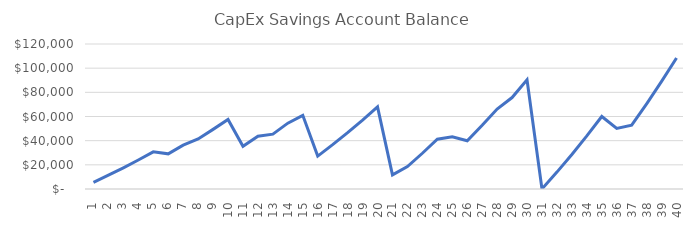
| Category | CapEx Savings Acct Balance |
|---|---|
| 1.0 | 5568 |
| 2.0 | 11414.4 |
| 3.0 | 17549.779 |
| 4.0 | 23985.079 |
| 5.0 | 30731.613 |
| 6.0 | 29106.528 |
| 7.0 | 36337.142 |
| 8.0 | 41452.075 |
| 9.0 | 49334.492 |
| 10.0 | 57586.159 |
| 11.0 | 35310.732 |
| 12.0 | 43724.361 |
| 13.0 | 45408.68 |
| 14.0 | 54493.649 |
| 15.0 | 60980.442 |
| 16.0 | 27251.726 |
| 17.0 | 36731.766 |
| 18.0 | 46669.457 |
| 19.0 | 57081.993 |
| 20.0 | 67987.155 |
| 21.0 | 11674.154 |
| 22.0 | 18545.168 |
| 23.0 | 29584.935 |
| 24.0 | 41165.564 |
| 25.0 | 43143.502 |
| 26.0 | 39961.193 |
| 27.0 | 52768.317 |
| 28.0 | 66191.821 |
| 29.0 | 75678.983 |
| 30.0 | 90313.92 |
| 31.0 | 49.278 |
| 32.0 | 13970.711 |
| 33.0 | 28588.186 |
| 34.0 | 43928.152 |
| 35.0 | 60017.964 |
| 36.0 | 50154.216 |
| 37.0 | 52803.522 |
| 38.0 | 70481.335 |
| 39.0 | 89011.356 |
| 40.0 | 108425.59 |